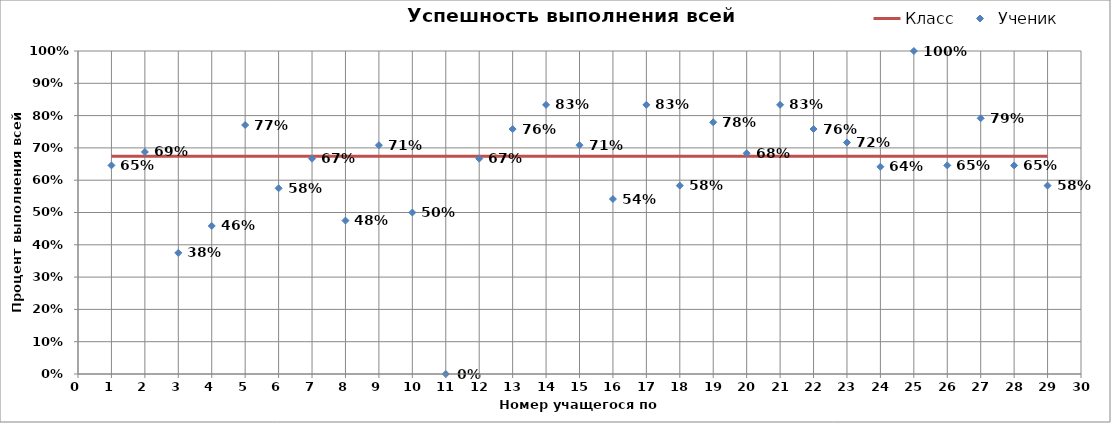
| Category | Класс |
|---|---|
| 0 | 0.674 |
| 1 | 0.674 |
| 2 | 0.674 |
| 3 | 0.674 |
| 4 | 0.674 |
| 5 | 0.674 |
| 6 | 0.674 |
| 7 | 0.674 |
| 8 | 0.674 |
| 9 | 0.674 |
| 10 | 0.674 |
| 11 | 0.674 |
| 12 | 0.674 |
| 13 | 0.674 |
| 14 | 0.674 |
| 15 | 0.674 |
| 16 | 0.674 |
| 17 | 0.674 |
| 18 | 0.674 |
| 19 | 0.674 |
| 20 | 0.674 |
| 21 | 0.674 |
| 22 | 0.674 |
| 23 | 0.674 |
| 24 | 0.674 |
| 25 | 0.674 |
| 26 | 0.674 |
| 27 | 0.674 |
| 28 | 0.674 |
| 29 | 0.674 |
| 30 | 0.674 |
| 31 | 0.674 |
| 32 | 0.674 |
| 33 | 0.674 |
| 34 | 0.674 |
| 35 | 0.674 |
| 36 | 0.674 |
| 37 | 0.674 |
| 38 | 0.674 |
| 39 | 0.674 |